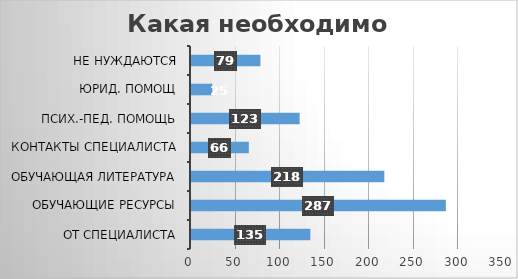
| Category | Series 0 |
|---|---|
| От специалиста | 135 |
| Обучающие ресурсы | 287 |
| Обучающая литература | 218 |
| Контакты специалиста | 66 |
| Псих.-пед. помощь | 123 |
| Юрид. помощ | 25 |
| Не нуждаются | 79 |